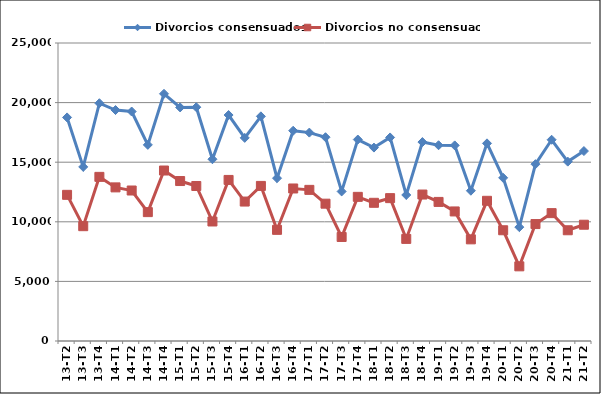
| Category | Divorcios consensuados | Divorcios no consensuados |
|---|---|---|
| 13-T2 | 18757 | 12262 |
| 13-T3 | 14604 | 9632 |
| 13-T4 | 19948 | 13769 |
| 14-T1 | 19376 | 12887 |
| 14-T2 | 19251 | 12625 |
| 14-T3 | 16454 | 10812 |
| 14-T4 | 20739 | 14302 |
| 15-T1 | 19595 | 13420 |
| 15-T2 | 19612 | 13004 |
| 15-T3 | 15249 | 10027 |
| 15-T4 | 18958 | 13512 |
| 16-T1 | 17041 | 11699 |
| 16-T2 | 18847 | 13011 |
| 16-T3 | 13660 | 9325 |
| 16-T4 | 17641 | 12795 |
| 17-T1 | 17483 | 12679 |
| 17-T2 | 17095 | 11520 |
| 17-T3 | 12545 | 8727 |
| 17-T4 | 16901 | 12093 |
| 18-T1 | 16226 | 11594 |
| 18-T2 | 17077 | 11986 |
| 18-T3 | 12249 | 8566 |
| 18-T4 | 16689 | 12287 |
| 19-T1 | 16423 | 11668 |
| 19-T2 | 16409 | 10869 |
| 19-T3 | 12607 | 8528 |
| 19-T4 | 16581 | 11761 |
| 20-T1 | 13690 | 9290 |
| 20-T2 | 9552 | 6264 |
| 20-T3 | 14835 | 9809 |
| 20-T4 | 16883 | 10727 |
| 21-T1 | 15048 | 9290 |
| 21-T2 | 15935 | 9754 |